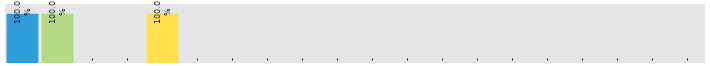
| Category | Monday |
|---|---|
| Accounts | 1 |
| HR | 1 |
| Lobby/Reception | 0 |
| Administration | 0 |
| Customer Support | 1 |
| Finance | 0 |
| Human Resources | 0 |
| IT | 0 |
| Marketing | 0 |
| R&D | 0 |
| Sales | 0 |